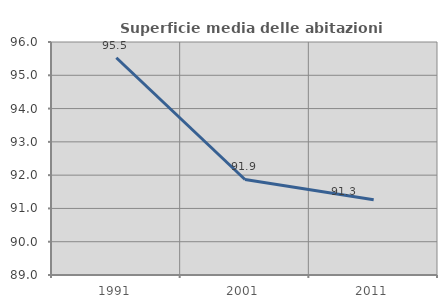
| Category | Superficie media delle abitazioni occupate |
|---|---|
| 1991.0 | 95.527 |
| 2001.0 | 91.87 |
| 2011.0 | 91.259 |